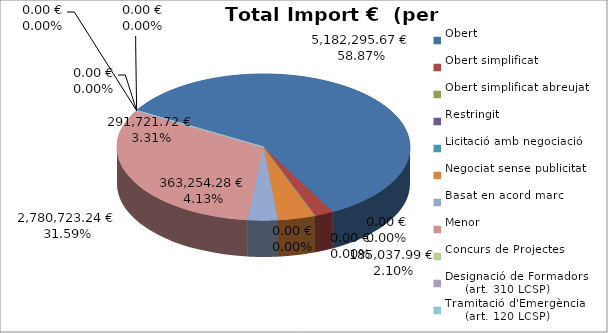
| Category | Total preu
(amb IVA) |
|---|---|
| Obert | 5182295.67 |
| Obert simplificat | 185037.99 |
| Obert simplificat abreujat | 0 |
| Restringit | 0 |
| Licitació amb negociació | 0 |
| Negociat sense publicitat | 363254.28 |
| Basat en acord marc | 291721.723 |
| Menor | 2780723.24 |
| Concurs de Projectes | 0 |
| Designació de Formadors
     (art. 310 LCSP) | 0 |
| Tramitació d'Emergència
     (art. 120 LCSP) | 0 |